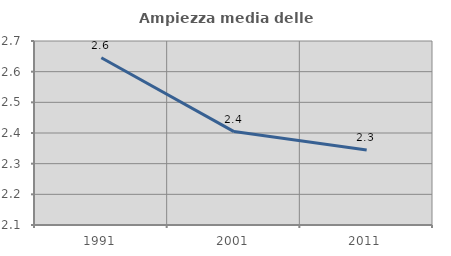
| Category | Ampiezza media delle famiglie |
|---|---|
| 1991.0 | 2.645 |
| 2001.0 | 2.405 |
| 2011.0 | 2.345 |